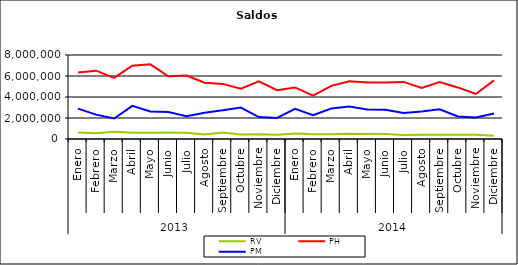
| Category | RV | PH | PM |
|---|---|---|---|
| 0 | 625726.624 | 6338490.057 | 2894951.851 |
| 1 | 552164.14 | 6505711.807 | 2320902.81 |
| 2 | 684317.675 | 5822855.149 | 1948127.804 |
| 3 | 601474.166 | 6976391.987 | 3151453.143 |
| 4 | 590050.657 | 7107878.906 | 2620515.735 |
| 5 | 624993.58 | 5975534.656 | 2574055.31 |
| 6 | 600696.535 | 6050025.472 | 2173848.831 |
| 7 | 419012.816 | 5367684.924 | 2503871.717 |
| 8 | 611730.758 | 5247250.768 | 2727549.288 |
| 9 | 419155.215 | 4784420.625 | 2990459.774 |
| 10 | 447319.577 | 5481772.72 | 2092491.866 |
| 11 | 408611.698 | 4646492.747 | 1999878.157 |
| 12 | 527889.485 | 4912075.273 | 2877652.76 |
| 13 | 454567.098 | 4120538.063 | 2278357.683 |
| 14 | 451499.2 | 5057360.029 | 2895505.472 |
| 15 | 496328.639 | 5498657.25 | 3083378.882 |
| 16 | 484463.452 | 5384146.137 | 2812191.042 |
| 17 | 465266.869 | 5373295.415 | 2775261.669 |
| 18 | 390003.439 | 5435984.925 | 2470327.976 |
| 19 | 403145.138 | 4872387.208 | 2622344.549 |
| 20 | 394930.475 | 5416500.478 | 2826484.554 |
| 21 | 412609.452 | 4912801.025 | 2138213.269 |
| 22 | 402733.198 | 4288987.896 | 2045982.83 |
| 23 | 298122.292 | 5581925.909 | 2431493.25 |